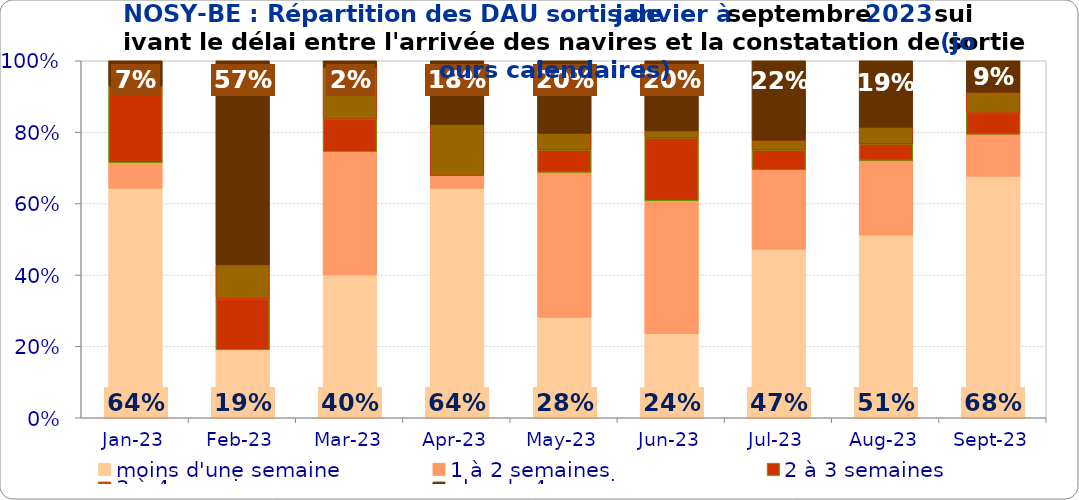
| Category | moins d'une semaine | 1 à 2 semaines | 2 à 3 semaines | 3 à 4 semaines | plus de 4 semaines |
|---|---|---|---|---|---|
| 2023-01-01 | 0.643 | 0.071 | 0.214 | 0 | 0.071 |
| 2023-02-01 | 0.19 | 0 | 0.143 | 0.095 | 0.571 |
| 2023-03-01 | 0.4 | 0.345 | 0.091 | 0.145 | 0.018 |
| 2023-04-01 | 0.643 | 0.036 | 0 | 0.143 | 0.179 |
| 2023-05-01 | 0.281 | 0.406 | 0.062 | 0.047 | 0.203 |
| 2023-06-01 | 0.235 | 0.373 | 0.176 | 0.02 | 0.196 |
| 2023-07-01 | 0.472 | 0.222 | 0.056 | 0.028 | 0.222 |
| 2023-08-01 | 0.512 | 0.209 | 0.047 | 0.047 | 0.186 |
| 2023-09-01 | 0.676 | 0.118 | 0.059 | 0.059 | 0.088 |